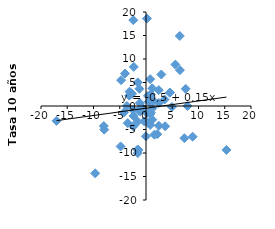
| Category | Chile |
|---|---|
| 0.660000000000005 | -21.537 |
| 15.32 | -9.352 |
| -17.02999999999999 | -3.164 |
| -4.74 | 5.5 |
| 2.9099999999999904 | 6.708 |
| -8.040000000000003 | -4.263 |
| -1.419999999999999 | -9.359 |
| -3.9999999999999925 | 6.904 |
| -9.68 | -14.318 |
| 5.5899999999999945 | 8.809 |
| -2.42 | 18.268 |
| 4.9399999999999995 | -0.21 |
| 0.34000000000000696 | -3.561 |
| -1.6199999999999992 | -9.287 |
| -2.410000000000001 | -4.348 |
| -1.5900000000000025 | -3.315 |
| 8.889999999999997 | -6.528 |
| 0.18000000000000238 | 18.603 |
| -4.830000000000001 | -8.603 |
| 1.419999999999999 | 1.123 |
| -2.4699999999999998 | -0.835 |
| -7.9600000000000035 | -5.039 |
| 3.6500000000000004 | -4.312 |
| 0.20000000000000018 | -1.514 |
| 1.5899999999999999 | -6.101 |
| -2.37 | -2.12 |
| 6.429999999999997 | 14.898 |
| -0.8400000000000019 | -0.675 |
| 0.8199999999999985 | -1.727 |
| 1.200000000000001 | -0.514 |
| 0.8000000000000007 | 5.71 |
| 2.430000000000004 | 0.637 |
| 1.200000000000001 | -2.903 |
| -1.5600000000000003 | 5.015 |
| 0.8099999999999996 | -4.02 |
| -1.16 | -1.176 |
| 6.459999999999999 | 7.627 |
| 1.200000000000001 | 3.765 |
| -3.63 | 0 |
| -0.7699999999999985 | -0.287 |
| 4.539999999999999 | 2.821 |
| 0.37000000000000366 | 2.164 |
| 7.31 | -6.851 |
| -3.1300000000000052 | 3.05 |
| -3.200000000000003 | 2.208 |
| -1.1700000000000044 | 0.621 |
| 2.4399999999999977 | 3.385 |
| 7.5600000000000005 | 3.642 |
| 7.899999999999996 | -0.007 |
| 0.5300000000000082 | 0.914 |
| -2.650000000000008 | 2.601 |
| 0.9250000000000091 | -1.424 |
| -2.3249999999999993 | 8.32 |
| 0.9399999999999964 | 2.477 |
| -4.200000000000004 | -1.366 |
| 2.4499999999999966 | -4.21 |
| 3.5500000000000087 | 1.384 |
| -0.01500000000000945 | -6.45 |
| -3.4800000000000164 | -3.637 |
| -1.2599999999999945 | 3.656 |
| -1.475000000000004 | -0.889 |
| 2.1399999999999864 | -5.999 |
| -0.33400000000001207 | -3.273 |
| -1.556000000000024 | -10.025 |
| 4.5560000000000045 | 2.871 |